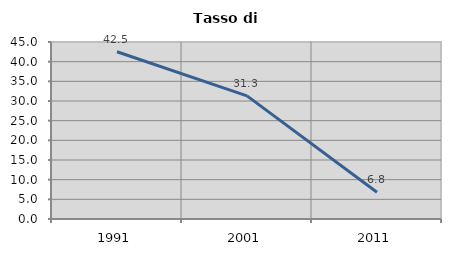
| Category | Tasso di disoccupazione   |
|---|---|
| 1991.0 | 42.512 |
| 2001.0 | 31.313 |
| 2011.0 | 6.796 |